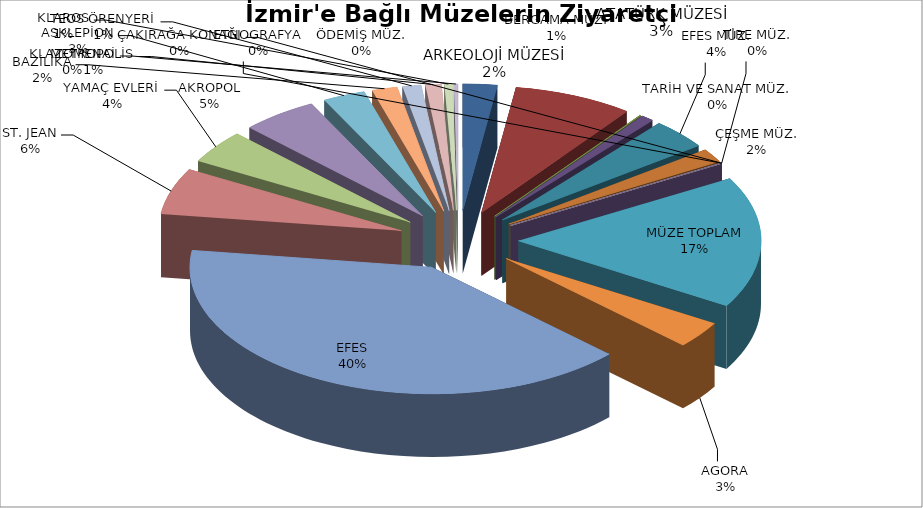
| Category | Series 0 |
|---|---|
| ARKEOLOJİ MÜZESİ | 4192 |
| ATATÜRK MÜZESİ | 14641 |
| TARİH VE SANAT MÜZ. | 133 |
| BERGAMA MÜZ. | 1585 |
| EFES MÜZ. | 7061 |
| ÇEŞME MÜZ. | 3196 |
| ÖDEMİŞ MÜZ. | 132 |
| TİRE MÜZ. | 0 |
| ÇAKIRAĞA KONAĞI | 0 |
| ETNOGRAFYA | 0 |
| MÜZE TOPLAM | 30940 |
| AGORA | 6306 |
| EFES | 73936 |
| ST. JEAN | 10895 |
| YAMAÇ EVLERİ | 7893 |
| AKROPOL | 9346 |
| ASKLEPİON | 5191 |
| BAZİLİKA | 3106 |
| TEOS ÖRENYERİ | 2270 |
| METROPOLİS | 1945 |
| KLAROS | 973 |
| KLAZOMENAİ | 490 |